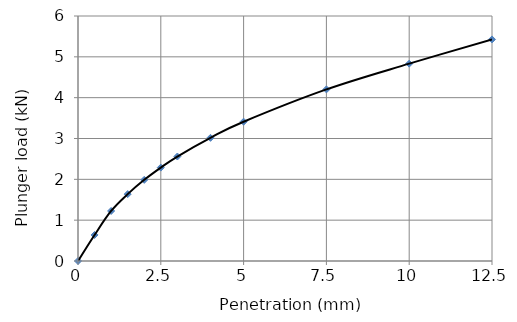
| Category | Series 0 |
|---|---|
| 0.0 | 0 |
| 0.5 | 0.638 |
| 1.0 | 1.225 |
| 1.5 | 1.638 |
| 2.0 | 1.988 |
| 2.5 | 2.288 |
| 3.0 | 2.559 |
| 4.0 | 3.016 |
| 5.0 | 3.411 |
| 7.5 | 4.202 |
| 10.0 | 4.833 |
| 12.5 | 5.426 |